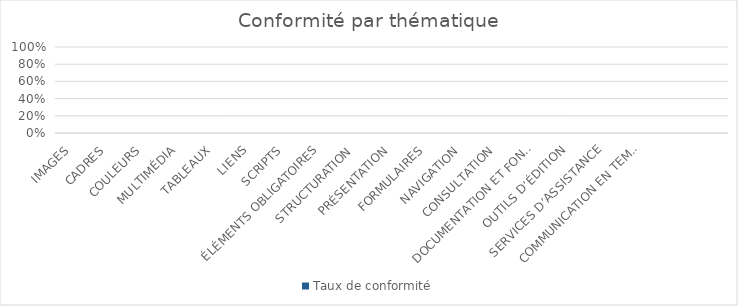
| Category | Taux de conformité | NC |
|---|---|---|
| IMAGES | 0 |  |
| CADRES | 0 |  |
| COULEURS | 0 |  |
| MULTIMÉDIA | 0 |  |
| TABLEAUX | 0 |  |
| LIENS | 0 |  |
| SCRIPTS | 0 |  |
| ÉLÉMENTS OBLIGATOIRES | 0 |  |
| STRUCTURATION | 0 |  |
| PRÉSENTATION | 0 |  |
| FORMULAIRES | 0 |  |
| NAVIGATION | 0 |  |
| CONSULTATION | 0 |  |
| DOCUMENTATION ET FONCTIONNALITÉS D’ACCESSIBILITÉ  | 0 |  |
| OUTILS D’ÉDITION | 0 |  |
| SERVICES D’ASSISTANCE | 0 |  |
| COMMUNICATION EN TEMPS RÉEL | 0 |  |